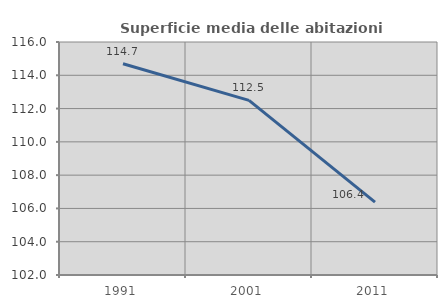
| Category | Superficie media delle abitazioni occupate |
|---|---|
| 1991.0 | 114.696 |
| 2001.0 | 112.494 |
| 2011.0 | 106.379 |